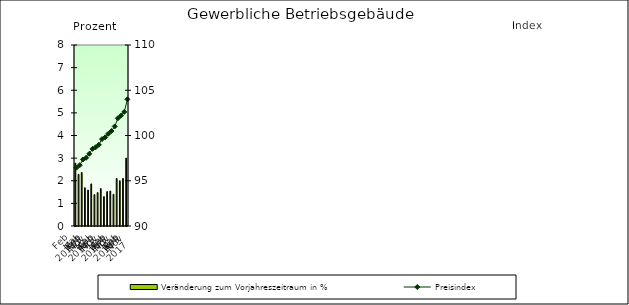
| Category | Veränderung zum Vorjahreszeitraum in % |
|---|---|
| 0 | 2.78 |
| 1 | 2.284 |
| 2 | 2.365 |
| 3 | 1.689 |
| 4 | 1.586 |
| 5 | 1.86 |
| 6 | 1.386 |
| 7 | 1.476 |
| 8 | 1.653 |
| 9 | 1.299 |
| 10 | 1.519 |
| 11 | 1.546 |
| 12 | 1.4 |
| 13 | 2.1 |
| 14 | 2 |
| 15 | 2.1 |
| 16 | 3 |